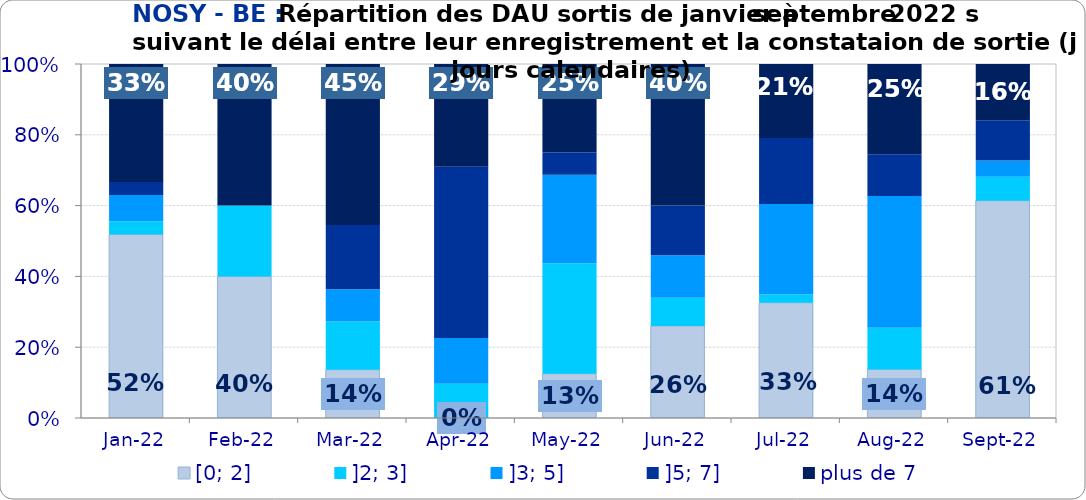
| Category | [0; 2] | ]2; 3] | ]3; 5] | ]5; 7] | plus de 7 |
|---|---|---|---|---|---|
| 2022-01-01 | 0.519 | 0.037 | 0.074 | 0.037 | 0.333 |
| 2022-02-01 | 0.4 | 0.2 | 0 | 0 | 0.4 |
| 2022-03-01 | 0.136 | 0.136 | 0.091 | 0.182 | 0.455 |
| 2022-04-01 | 0 | 0.097 | 0.129 | 0.484 | 0.29 |
| 2022-05-01 | 0.125 | 0.312 | 0.25 | 0.062 | 0.25 |
| 2022-06-01 | 0.26 | 0.08 | 0.12 | 0.14 | 0.4 |
| 2022-07-01 | 0.326 | 0.023 | 0.256 | 0.186 | 0.209 |
| 2022-08-01 | 0.137 | 0.118 | 0.373 | 0.118 | 0.255 |
| 2022-09-01 | 0.614 | 0.068 | 0.045 | 0.114 | 0.159 |